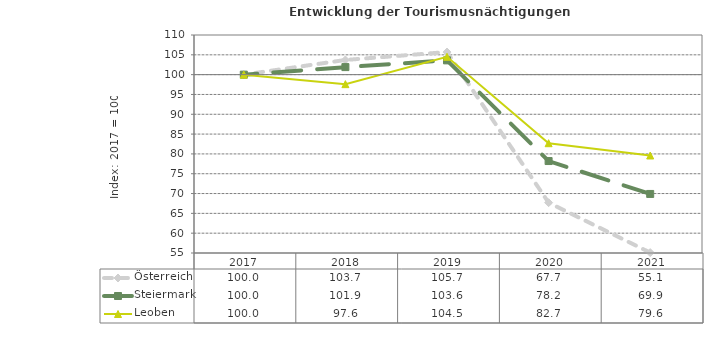
| Category | Österreich | Steiermark | Leoben |
|---|---|---|---|
| 2021.0 | 55.1 | 69.9 | 79.6 |
| 2020.0 | 67.7 | 78.2 | 82.7 |
| 2019.0 | 105.7 | 103.6 | 104.5 |
| 2018.0 | 103.7 | 101.9 | 97.6 |
| 2017.0 | 100 | 100 | 100 |